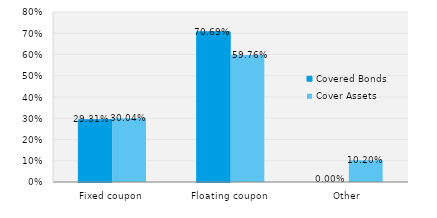
| Category | Covered Bonds | Cover Assets |
|---|---|---|
| Fixed coupon | 0.293 | 0.3 |
| Floating coupon | 0.707 | 0.598 |
| Other | 0 | 0.102 |